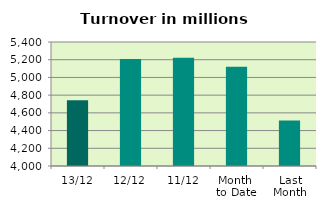
| Category | Series 0 |
|---|---|
| 13/12 | 4741.974 |
| 12/12 | 5208.157 |
| 11/12 | 5222.153 |
| Month 
to Date | 5121.491 |
| Last
Month | 4514.728 |